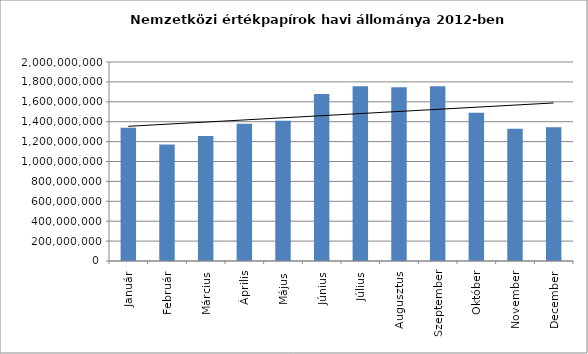
| Category | Series 0 |
|---|---|
| Január | 1338227192 |
| Február | 1171218616 |
| Március | 1255735211 |
| Április | 1378759625 |
| Május | 1409500182 |
| Június | 1678725901 |
| Július | 1755387957 |
| Augusztus | 1745358988 |
| Szeptember | 1756764239 |
| Október | 1490999329 |
| November | 1328246393 |
| December | 1344679574 |